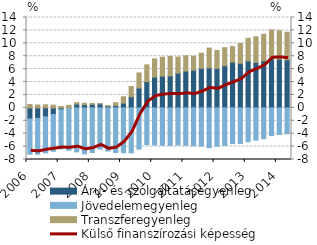
| Category | Áru- és szolgáltatásegyenleg | Jövedelemegyenleg | Transzferegyenleg |
|---|---|---|---|
| 2006.0 | -1.718 | -5.452 | 0.52 |
| 2006.0 | -1.632 | -5.556 | 0.443 |
| 2006.0 | -1.393 | -5.573 | 0.476 |
| 2006.0 | -1.031 | -5.701 | 0.418 |
| 2007.0 | -0.297 | -6.057 | 0.209 |
| 2007.0 | -0.021 | -6.558 | 0.389 |
| 2007.0 | 0.584 | -6.822 | 0.222 |
| 2007.0 | 0.498 | -7.131 | 0.202 |
| 2008.0 | 0.547 | -6.918 | 0.145 |
| 2008.0 | 0.613 | -6.375 | 0.016 |
| 2008.0 | 0.278 | -6.687 | 0.057 |
| 2008.0 | 0.359 | -6.936 | 0.438 |
| 2009.0 | 0.731 | -6.96 | 0.991 |
| 2009.0 | 1.705 | -6.966 | 1.597 |
| 2009.0 | 3.081 | -6.394 | 2.328 |
| 2009.0 | 4.056 | -5.703 | 2.608 |
| 2010.0 | 4.769 | -5.764 | 2.812 |
| 2010.0 | 4.923 | -5.79 | 2.925 |
| 2010.0 | 4.955 | -5.811 | 3.006 |
| 2010.0 | 5.378 | -5.755 | 2.494 |
| 2011.0 | 5.69 | -5.809 | 2.377 |
| 2011.0 | 5.84 | -5.881 | 2.167 |
| 2011.0 | 6.134 | -5.931 | 2.331 |
| 2011.0 | 6.192 | -6.168 | 3.073 |
| 2012.0 | 6.104 | -5.951 | 2.783 |
| 2012.0 | 6.536 | -5.81 | 2.793 |
| 2012.0 | 7.084 | -5.536 | 2.41 |
| 2012.0 | 6.916 | -5.512 | 3.053 |
| 2013.0 | 7.264 | -5.245 | 3.511 |
| 2013.0 | 7.027 | -5.001 | 3.983 |
| 2013.0 | 7.286 | -4.767 | 4.101 |
| 2013.0 | 7.587 | -4.297 | 4.475 |
| 2014.0 | 7.56 | -4.129 | 4.391 |
| 2014.0 | 7.45 | -4.011 | 4.265 |